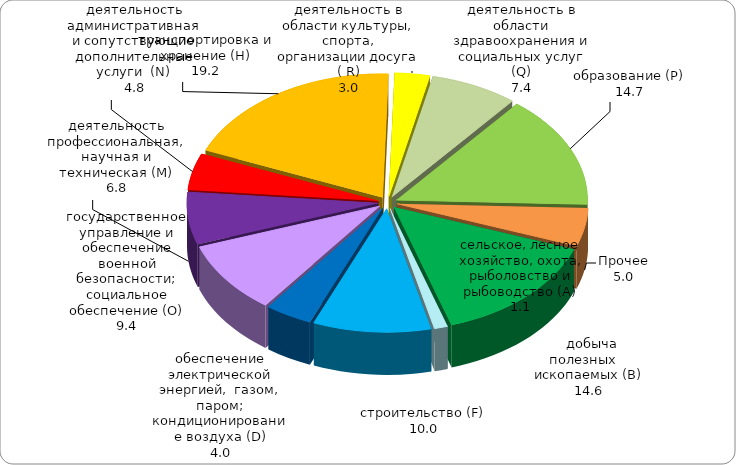
| Category | Series 3 | Series 2 | Series 1 | Series 0 |
|---|---|---|---|---|
|     добыча   полезных    ископаемых (В) | 14.567 |  |  |  |
| сельское, лесное хозяйство, охота, рыболовство и рыбоводство (А) | 1.126 |  |  |  |
| строительство (F) | 9.955 |  |  |  |
| обеспечение электрической энергией,  газом, паром; кондиционирование воздуха (D) | 3.969 |  |  |  |
| государственное управление и обеспечение военной безопасности; социальное обеспечение (О) | 9.414 |  |  |  |
| деятельность профессиональная, научная и техническая (М) | 6.793 |  |  |  |
| деятельность административная и сопутствующие дополнительные услуги  (N) | 4.771 |  |  |  |
| транспортировка и хранение (H) | 19.248 |  |  |  |
| деятельность в области культуры, спорта, организации досуга ( R) | 2.958 |  |  |  |
| деятельность в области здравоохранения и социальных услуг (Q) | 7.391 |  |  |  |
| образование (Р) | 14.687 |  |  |  |
| Прочее | 5 |  |  |  |